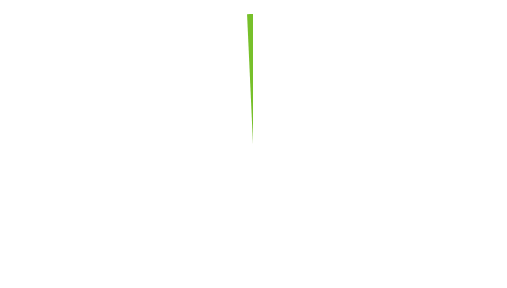
| Category | Series 0 |
|---|---|
| 0 | 30 |
| 1 | 0.22 |
| 2 | 0 |